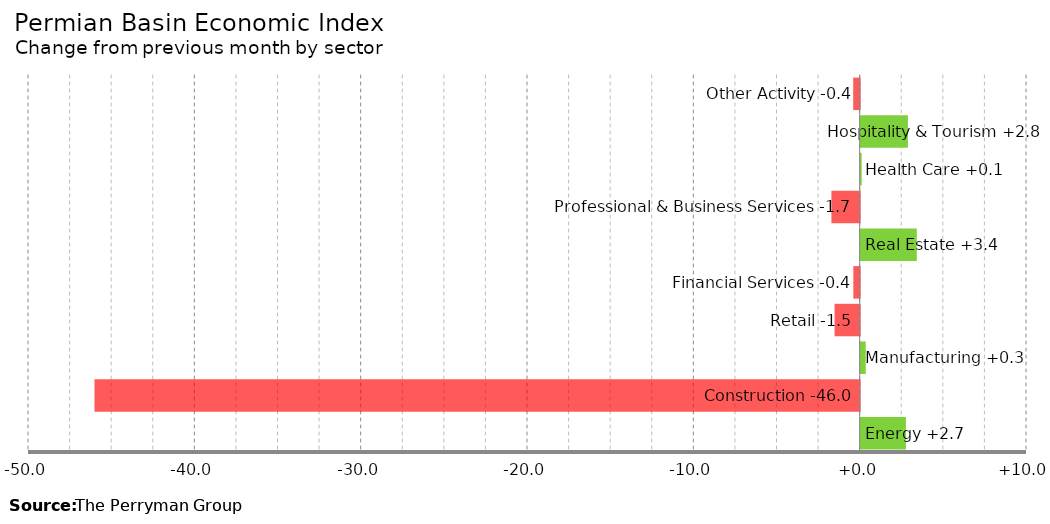
| Category | Change |
|---|---|
| Energy | 2.721 |
| Construction | -46.002 |
| Manufacturing | 0.305 |
| Retail | -1.509 |
| Financial Services | -0.38 |
| Real Estate | 3.375 |
| Professional & Business Services | -1.699 |
| Health Care | 0.062 |
| Hospitality & Tourism | 2.841 |
| Other Activity | -0.389 |